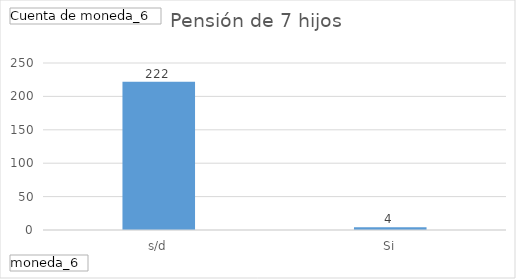
| Category | Total |
|---|---|
| s/d | 222 |
| Si | 4 |